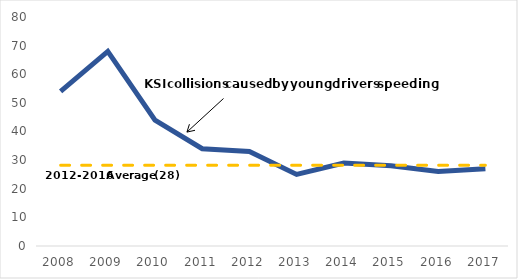
| Category | Series 0 | Series 1 |
|---|---|---|
| 2008.0 | 54 | 28.2 |
| 2009.0 | 68 | 28.2 |
| 2010.0 | 44 | 28.2 |
| 2011.0 | 34 | 28.2 |
| 2012.0 | 33 | 28.2 |
| 2013.0 | 25 | 28.2 |
| 2014.0 | 29 | 28.2 |
| 2015.0 | 28 | 28.2 |
| 2016.0 | 26 | 28.2 |
| 2017.0 | 27 | 28.2 |